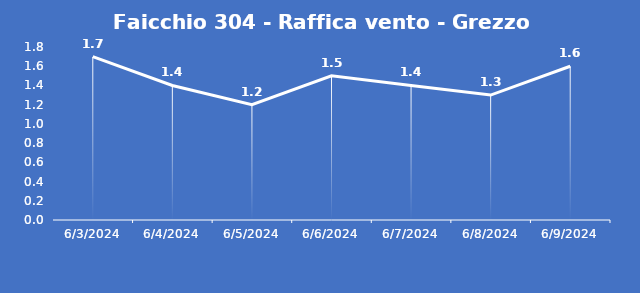
| Category | Faicchio 304 - Raffica vento - Grezzo (m/s) |
|---|---|
| 6/3/24 | 1.7 |
| 6/4/24 | 1.4 |
| 6/5/24 | 1.2 |
| 6/6/24 | 1.5 |
| 6/7/24 | 1.4 |
| 6/8/24 | 1.3 |
| 6/9/24 | 1.6 |